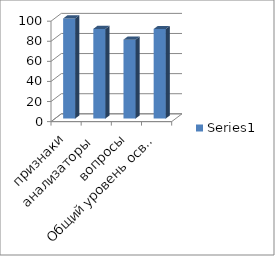
| Category | Series 0 |
|---|---|
| признаки | 99.673 |
| анализаторы | 89.286 |
| вопросы | 78.571 |
| Общий уровень освоения МК | 89.177 |